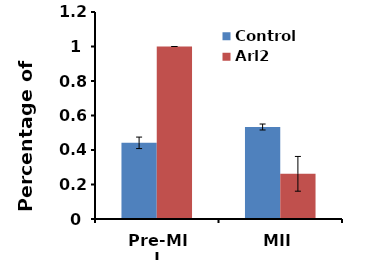
| Category | Control | Arl2 |
|---|---|---|
| Pre-MII | 0.442 | 1 |
| MII | 0.533 | 0.262 |